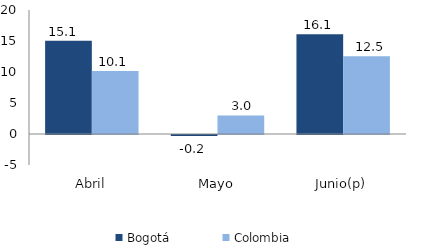
| Category | Bogotá | Colombia |
|---|---|---|
| Abril | 15.052 | 10.142 |
| Mayo | -0.15 | 2.986 |
| Junio(p) | 16.097 | 12.531 |